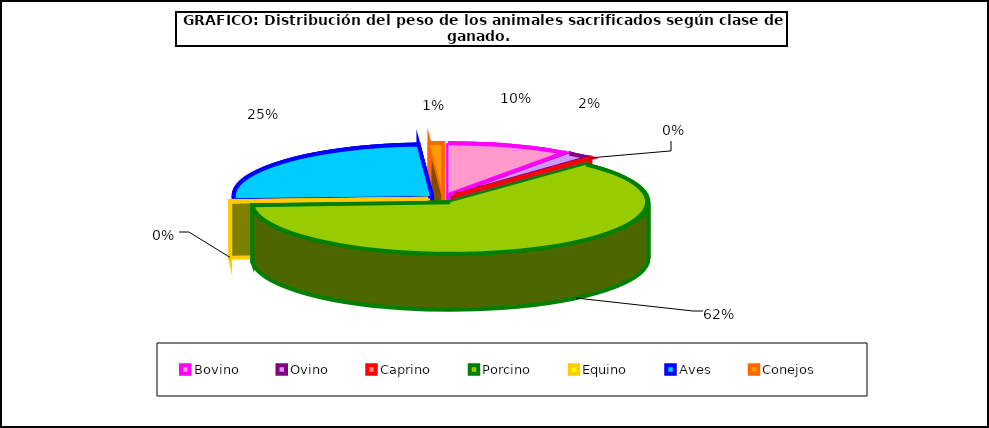
| Category | Series 0 |
|---|---|
| 0 | 578600.204 |
| 1 | 114219.96 |
| 2 | 8621.518 |
| 3 | 3620221.723 |
| 4 | 11528.895 |
| 5 | 1436688.861 |
| 6 | 63789.699 |